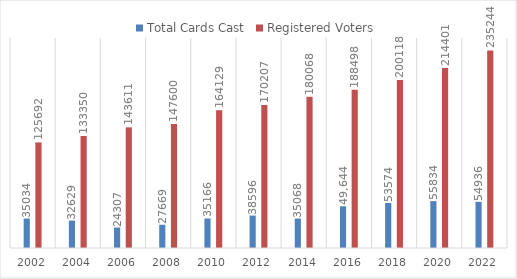
| Category | Total Cards Cast | Registered Voters |
|---|---|---|
| 2002.0 | 35034 | 125692 |
| 2004.0 | 32629 | 133350 |
| 2006.0 | 24307 | 143611 |
| 2008.0 | 27669 | 147600 |
| 2010.0 | 35166 | 164129 |
| 2012.0 | 38596 | 170207 |
| 2014.0 | 35068 | 180068 |
| 2016.0 | 49644 | 188498 |
| 2018.0 | 53574 | 200118 |
| 2020.0 | 55834 | 214401 |
| 2022.0 | 54936 | 235244 |